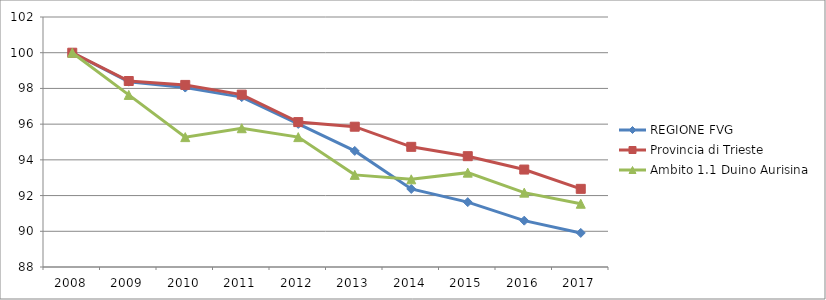
| Category | REGIONE FVG | Provincia di Trieste | Ambito 1.1 Duino Aurisina |
|---|---|---|---|
| 2008.0 | 100 | 100 | 100 |
| 2009.0 | 98.378 | 98.416 | 97.637 |
| 2010.0 | 98.049 | 98.197 | 95.274 |
| 2011.0 | 97.515 | 97.653 | 95.771 |
| 2012.0 | 96.012 | 96.115 | 95.274 |
| 2013.0 | 94.5 | 95.857 | 93.159 |
| 2014.0 | 92.37 | 94.73 | 92.91 |
| 2015.0 | 91.632 | 94.206 | 93.284 |
| 2016.0 | 90.595 | 93.457 | 92.164 |
| 2017.0 | 89.908 | 92.376 | 91.542 |